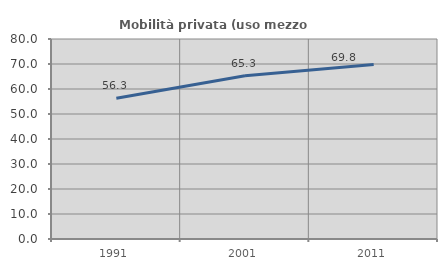
| Category | Mobilità privata (uso mezzo privato) |
|---|---|
| 1991.0 | 56.315 |
| 2001.0 | 65.319 |
| 2011.0 | 69.83 |